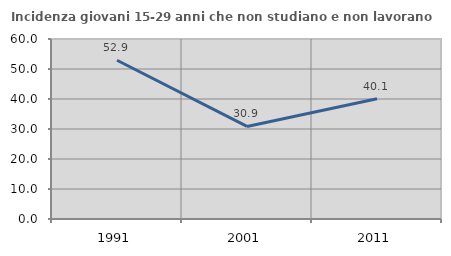
| Category | Incidenza giovani 15-29 anni che non studiano e non lavorano  |
|---|---|
| 1991.0 | 52.917 |
| 2001.0 | 30.859 |
| 2011.0 | 40.062 |